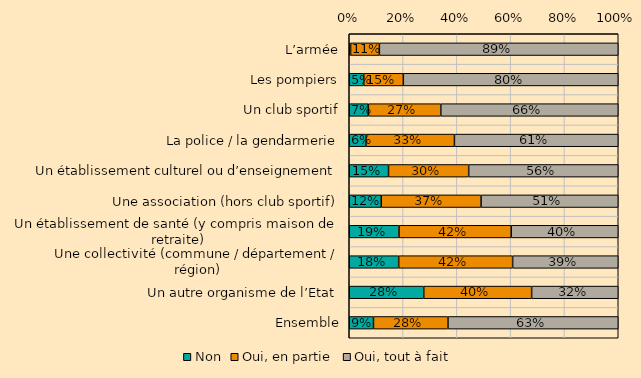
| Category | Non | Oui, en partie | Oui, tout à fait |
|---|---|---|---|
| L’armée | 0.005 | 0.107 | 0.888 |
| Les pompiers | 0.054 | 0.147 | 0.799 |
| Un club sportif | 0.071 | 0.269 | 0.659 |
| La police / la gendarmerie | 0.062 | 0.329 | 0.609 |
| Un établissement culturel ou d’enseignement | 0.146 | 0.298 | 0.556 |
| Une association (hors club sportif) | 0.119 | 0.371 | 0.51 |
| Un établissement de santé (y compris maison de retraite) | 0.185 | 0.417 | 0.398 |
| Une collectivité (commune / département / région) | 0.184 | 0.424 | 0.393 |
| Un autre organisme de l’Etat | 0.277 | 0.401 | 0.322 |
| Ensemble | 0.09 | 0.277 | 0.633 |